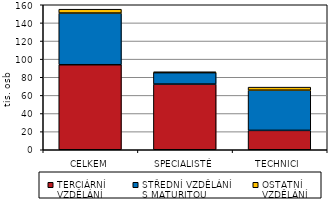
| Category | TERCIÁRNÍ 
VZDĚLÁNÍ | STŘEDNÍ VZDĚLÁNÍ
S MATURITOU | OSTATNÍ
VZDĚLÁNÍ |
|---|---|---|---|
| CELKEM | 93.823 | 57.012 | 4.268 |
| SPECIALISTÉ | 72.455 | 12.644 | 0.907 |
| TECHNICI | 21.367 | 44.367 | 3.36 |